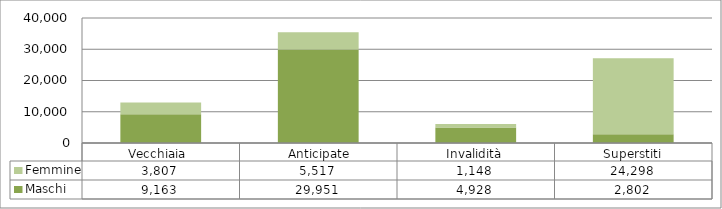
| Category | Maschi | Femmine |
|---|---|---|
| Vecchiaia  | 9163 | 3807 |
|  Anticipate | 29951 | 5517 |
| Invalidità | 4928 | 1148 |
| Superstiti | 2802 | 24298 |